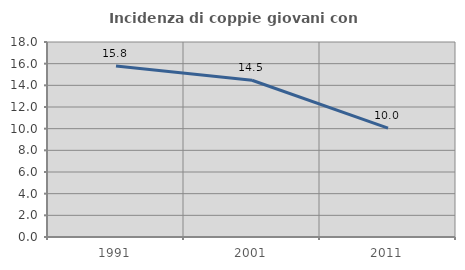
| Category | Incidenza di coppie giovani con figli |
|---|---|
| 1991.0 | 15.778 |
| 2001.0 | 14.47 |
| 2011.0 | 10.045 |